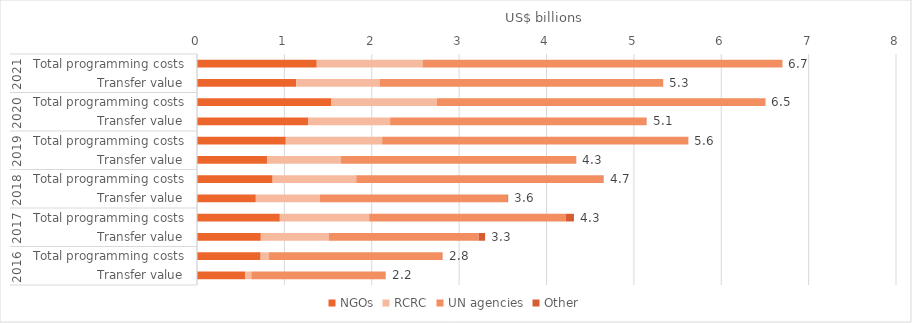
| Category | NGOs | RCRC | UN agencies | Other |
|---|---|---|---|---|
| 0 | 0.553 | 0.069 | 1.535 | 0.003 |
| 1 | 0.728 | 0.094 | 1.984 | 0.004 |
| 2 | 0.73 | 0.78 | 1.714 | 0.073 |
| 3 | 0.948 | 1.023 | 2.248 | 0.095 |
| 4 | 0.673 | 0.729 | 2.149 | 0.009 |
| 5 | 0.866 | 0.957 | 2.818 | 0.012 |
| 6 | 0.801 | 0.847 | 2.691 | 0.001 |
| 7 | 1.016 | 1.103 | 3.503 | 0.002 |
| 8 | 1.27 | 0.94 | 2.932 | 0.004 |
| 9 | 1.539 | 1.204 | 3.756 | 0.005 |
| 10 | 1.135 | 0.954 | 3.245 | 0.001 |
| 11 | 1.371 | 1.211 | 4.118 | 0.001 |